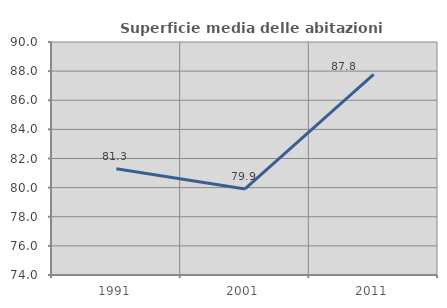
| Category | Superficie media delle abitazioni occupate |
|---|---|
| 1991.0 | 81.298 |
| 2001.0 | 79.912 |
| 2011.0 | 87.778 |